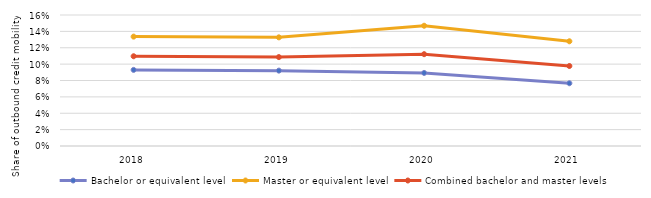
| Category | Bachelor or equivalent level | Master or equivalent level | Combined bachelor and master levels |
|---|---|---|---|
| 2018.0 | 0.093 | 0.134 | 0.11 |
| 2019.0 | 0.092 | 0.133 | 0.109 |
| 2020.0 | 0.089 | 0.147 | 0.112 |
| 2021.0 | 0.077 | 0.128 | 0.098 |